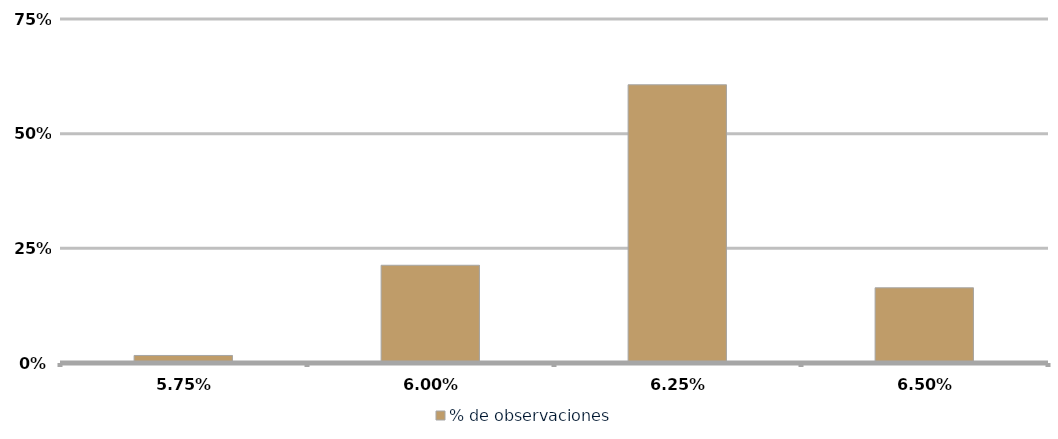
| Category | % de observaciones  |
|---|---|
| 0.057499999999999996 | 0.016 |
| 0.06 | 0.213 |
| 0.0625 | 0.607 |
| 0.065 | 0.164 |